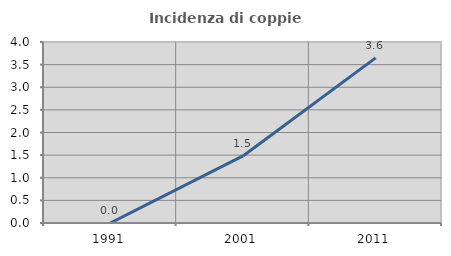
| Category | Incidenza di coppie miste |
|---|---|
| 1991.0 | 0 |
| 2001.0 | 1.481 |
| 2011.0 | 3.65 |